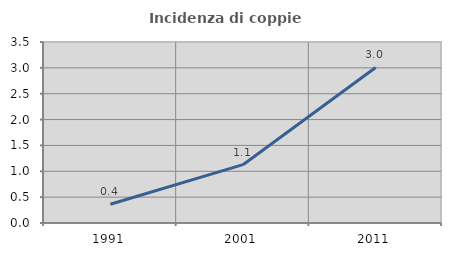
| Category | Incidenza di coppie miste |
|---|---|
| 1991.0 | 0.362 |
| 2001.0 | 1.128 |
| 2011.0 | 3.008 |